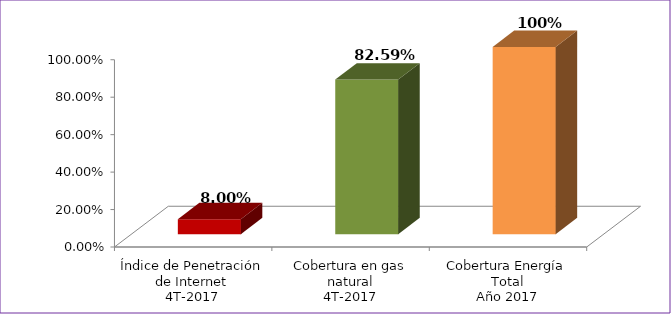
| Category | Series 0 |
|---|---|
| Índice de Penetración de Internet
4T-2017 | 0.08 |
| Cobertura en gas natural
4T-2017 | 0.826 |
| Cobertura Energía Total
Año 2017 | 1 |